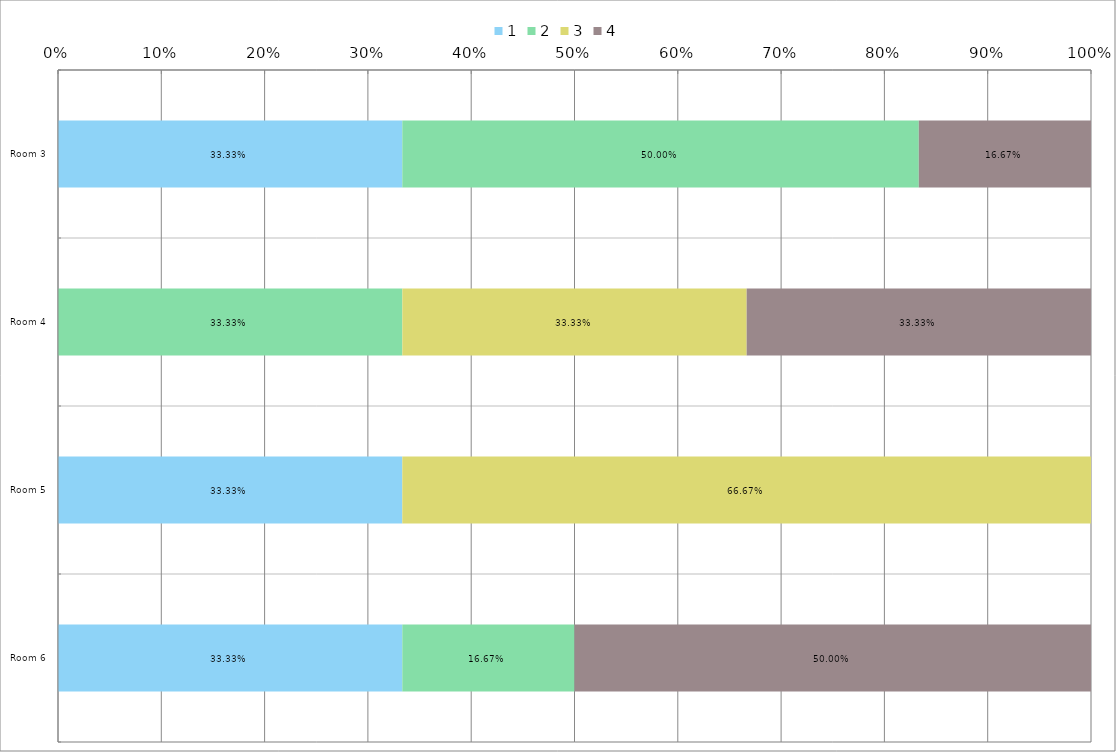
| Category | 1 | 2 | 3 | 4 |
|---|---|---|---|---|
| 0 | 0.333 | 0.5 | 0 | 0.167 |
| 1 | 0 | 0.333 | 0.333 | 0.333 |
| 2 | 0.333 | 0 | 0.667 | 0 |
| 3 | 0.333 | 0.167 | 0 | 0.5 |